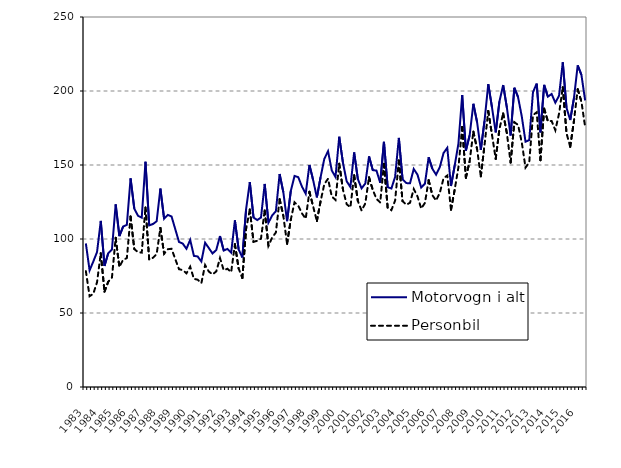
| Category | Motorvogn i alt | Personbil |
|---|---|---|
| 1983.0 | 97 | 78.3 |
| nan | 78.8 | 61.3 |
| nan | 84.8 | 63 |
| nan | 91.2 | 70.8 |
| 1984.0 | 112.2 | 90.4 |
| nan | 81.8 | 64.4 |
| nan | 90.4 | 71.1 |
| nan | 92.9 | 73.9 |
| 1985.0 | 123.4 | 100.8 |
| nan | 102 | 81.1 |
| nan | 108.4 | 86 |
| nan | 109.6 | 87.1 |
| 1986.0 | 141 | 115.2 |
| nan | 120.5 | 93.2 |
| nan | 115.7 | 91.1 |
| nan | 114.4 | 90.8 |
| 1987.0 | 152.2 | 121.3 |
| nan | 109.2 | 86.1 |
| nan | 110.1 | 87.3 |
| nan | 112 | 89.8 |
| 1988.0 | 134.1 | 107.5 |
| nan | 113.7 | 90 |
| nan | 116.3 | 93.1 |
| nan | 115.2 | 93.4 |
| 1989.0 | 106.6 | 86.4 |
| nan | 98 | 79.6 |
| nan | 96.9 | 79 |
| nan | 93.4 | 76.8 |
| 1990.0 | 99.4 | 81.3 |
| nan | 88.6 | 73.1 |
| nan | 88.2 | 72.5 |
| nan | 84.8 | 70.2 |
| 1991.0 | 97.5 | 82.4 |
| nan | 93.9 | 78 |
| nan | 90.2 | 76.1 |
| nan | 92.6 | 78.1 |
| 1992.0 | 102 | 87.1 |
| nan | 92.2 | 78.9 |
| nan | 93.3 | 79.9 |
| nan | 90.8 | 77.6 |
| 1993.0 | 112.6 | 96.5 |
| nan | 93 | 80.1 |
| nan | 87.5 | 73.6 |
| nan | 120.1 | 106.6 |
| 1994.0 | 138.4 | 120 |
| nan | 114.5 | 98.1 |
| nan | 112.8 | 98.8 |
| nan | 114.5 | 100.2 |
| 1995.0 | 137.2 | 119.3 |
| nan | 111 | 95.4 |
| nan | 115.9 | 101 |
| nan | 118.8 | 104.4 |
| 1996.0 | 143.9 | 126.9 |
| nan | 131.6 | 115.7 |
| nan | 112 | 96.7 |
| nan | 132.5 | 113.1 |
| 1997.0 | 142.6 | 124.8 |
| nan | 141.8 | 122.5 |
| nan | 135.4 | 117.3 |
| nan | 130.6 | 113.7 |
| 1998.0 | 150 | 131.9 |
| nan | 139.8 | 122 |
| nan | 128.1 | 112.1 |
| nan | 141.8 | 125.6 |
| 1999.0 | 154.2 | 137.1 |
| nan | 159.3 | 140.7 |
| nan | 146.3 | 128.7 |
| nan | 141.9 | 126.4 |
| 2000.0 | 169.1 | 150.9 |
| nan | 151.5 | 133.4 |
| nan | 139 | 123.5 |
| nan | 135.1 | 121.4 |
| 2001.0 | 158.5 | 143.1 |
| nan | 140.46 | 125.7 |
| nan | 134.24 | 119.2 |
| nan | 137.495 | 124.072 |
| 2002.0 | 155.814 | 141.724 |
| nan | 146.543 | 133.19 |
| nan | 146.231 | 127.141 |
| nan | 137.967 | 124.641 |
| 2003.0 | 165.679 | 150.811 |
| nan | 135.021 | 121.101 |
| nan | 134.111 | 119.491 |
| nan | 142.013 | 125.959 |
| 2004.0 | 168.309 | 153.043 |
| nan | 140.267 | 125.568 |
| nan | 137.77 | 123.121 |
| nan | 137.685 | 124.506 |
| 2005.0 | 147.311 | 133.756 |
| nan | 143.517 | 128.79 |
| nan | 134.783 | 120.571 |
| nan | 137.37 | 124.382 |
| 2006.0 | 155.213 | 139.728 |
| nan | 147.444 | 129.572 |
| nan | 143.451 | 126.006 |
| nan | 148.561 | 131.195 |
| 2007.0 | 158.1 | 141.084 |
| nan | 161.613 | 142.897 |
| nan | 135.821 | 119.753 |
| nan | 149.791 | 133.498 |
| 2008.0 | 164.642 | 148.614 |
| nan | 197.287 | 175.714 |
| nan | 159.718 | 141.407 |
| nan | 170.057 | 152.54 |
| 2009.0 | 191.38 | 172.559 |
| nan | 178.906 | 160.765 |
| nan | 160.234 | 142.312 |
| nan | 179.857 | 163.532 |
| 2010.0 | 204.636 | 186.507 |
| nan | 188.957 | 170.463 |
| nan | 172.077 | 154.156 |
| nan | 192.961 | 174.399 |
| 2011.0 | 204.005 | 184.86 |
| nan | 188.741 | 171.333 |
| nan | 169.934 | 151.694 |
| nan | 202.176 | 178.919 |
| 2012.0 | 195.829 | 177.072 |
| nan | 182.751 | 165.128 |
| nan | 165.73 | 148.242 |
| nan | 166.805 | 151.728 |
| 2013.0 | 199.181 | 183.653 |
| nan | 205.015 | 185.634 |
| nan | 172.044 | 153.21 |
| nan | 204.1 | 188.079 |
| 2014.0 | 196.177 | 179.552 |
| nan | 197.965 | 179.767 |
| nan | 192.105 | 173.474 |
| nan | 196.809 | 184.739 |
| 2015.0 | 219.419 | 202.592 |
| nan | 188.696 | 171.451 |
| nan | 180.388 | 162.297 |
| nan | 195.23 | 179.891 |
| 2016.0 | 217.298 | 201.197 |
| nan | 210.949 | 192.893 |
| nan | 193.648 | 175.642 |